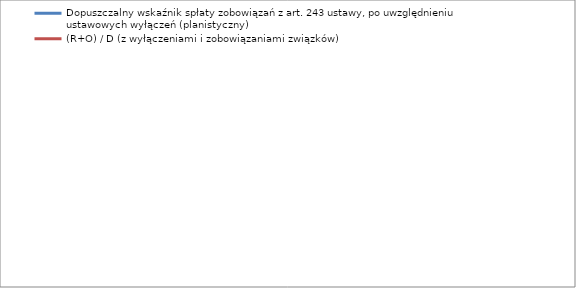
| Category | Dopuszczalny wskaźnik spłaty zobowiązań z art. 243 ustawy, po uwzględnieniu ustawowych wyłączeń (planistyczny)  | (R+O) / D (z wyłączeniami i zobowiązaniami związków) |
|---|---|---|
| 2014.0 | 0.189 | 0.056 |
| 2015.0 | 0.218 | 0 |
| 2016.0 | 0.183 | 0 |
| 2017.0 | 0.187 | 0 |